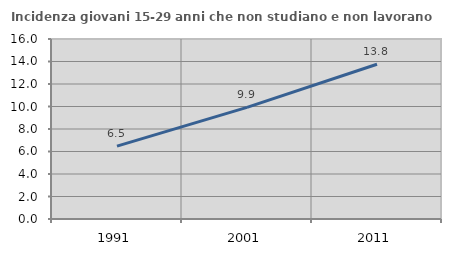
| Category | Incidenza giovani 15-29 anni che non studiano e non lavorano  |
|---|---|
| 1991.0 | 6.475 |
| 2001.0 | 9.925 |
| 2011.0 | 13.752 |